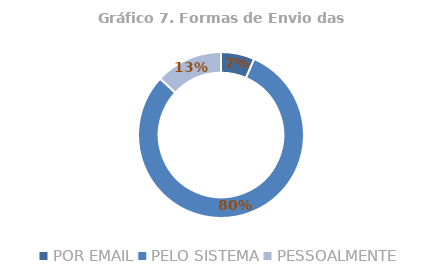
| Category | Total |
|---|---|
| POR EMAIL | 0.066 |
| PELO SISTEMA | 0.803 |
| PESSOALMENTE | 0.131 |